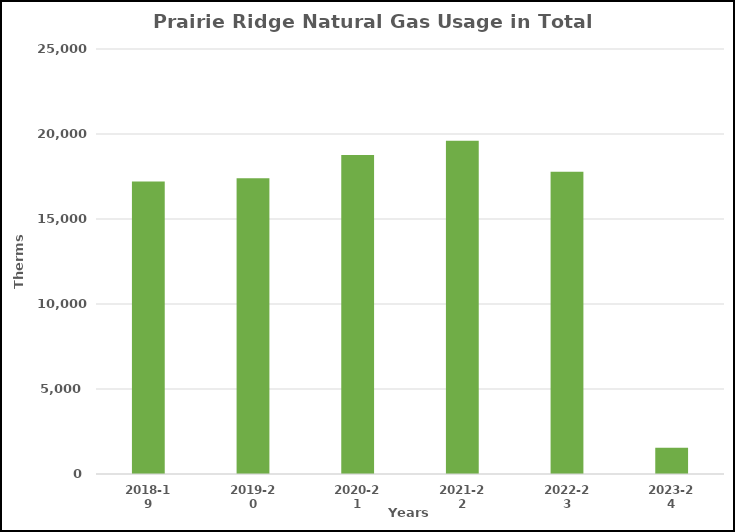
| Category | Series 0 |
|---|---|
| 2018-19 | 17199 |
| 2019-20 | 17395 |
| 2020-21 | 18760 |
| 2021-22 | 19599 |
| 2022-23 | 17784 |
| 2023-24 | 1544 |